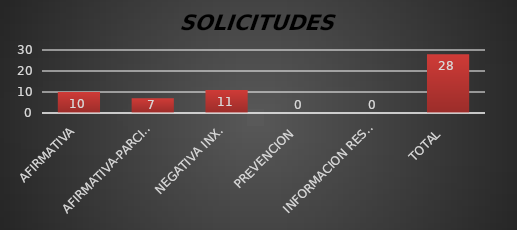
| Category | Series 1 |
|---|---|
| AFIRMATIVA | 10 |
| AFIRMATIVA-PARCIAL | 7 |
| NEGATIVA INX. | 11 |
| PREVENCION  | 0 |
| INFORMACION RESERVADA | 0 |
| TOTAL  | 28 |